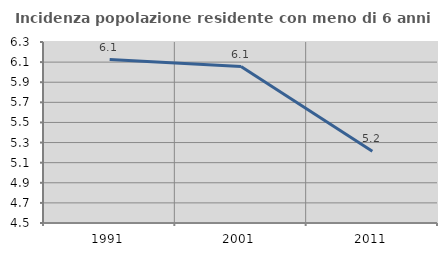
| Category | Incidenza popolazione residente con meno di 6 anni |
|---|---|
| 1991.0 | 6.125 |
| 2001.0 | 6.056 |
| 2011.0 | 5.214 |